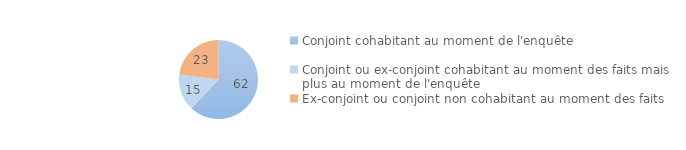
| Category | Series 0 |
|---|---|
| Conjoint cohabitant au moment de l'enquête | 62 |
| Conjoint ou ex-conjoint cohabitant au moment des faits mais plus au moment de l'enquête | 15 |
| Ex-conjoint ou conjoint non cohabitant au moment des faits | 23 |